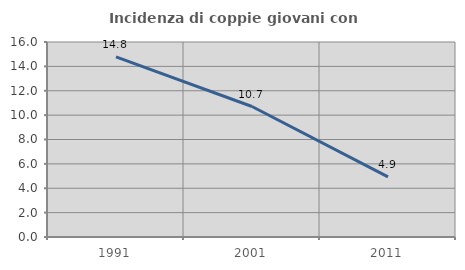
| Category | Incidenza di coppie giovani con figli |
|---|---|
| 1991.0 | 14.776 |
| 2001.0 | 10.706 |
| 2011.0 | 4.935 |